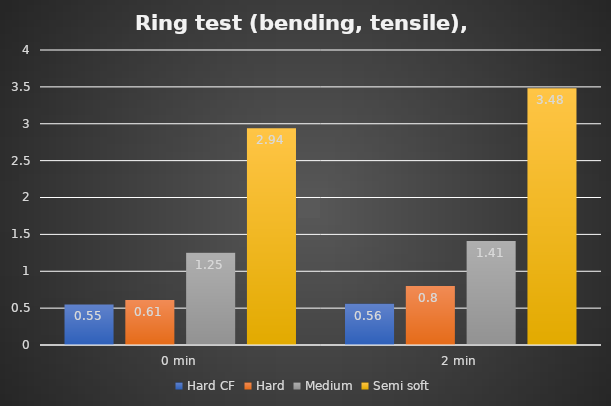
| Category | Hard CF | Hard | Medium | Semi soft |
|---|---|---|---|---|
| 0 min | 0.55 | 0.61 | 1.25 | 2.94 |
| 2 min | 0.56 | 0.8 | 1.41 | 3.48 |